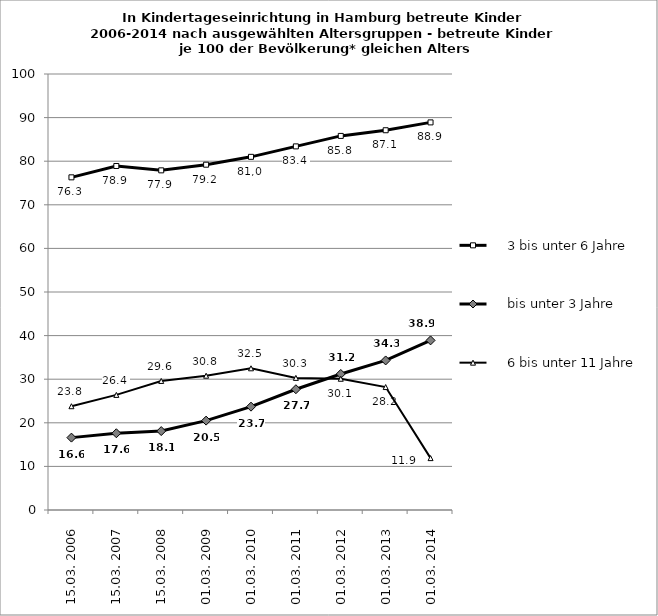
| Category |     3 bis unter 6 Jahre |     bis unter 3 Jahre |     6 bis unter 11 Jahre |
|---|---|---|---|
| 15.03. 2006 | 76.3 | 16.6 | 23.8 |
| 15.03. 2007 | 78.9 | 17.6 | 26.4 |
| 15.03. 2008 | 77.9 | 18.1 | 29.6 |
| 01.03. 2009 | 79.2 | 20.5 | 30.8 |
| 01.03. 2010 | 81 | 23.7 | 32.5 |
| 01.03. 2011 | 83.4 | 27.7 | 30.3 |
| 01.03. 2012 | 85.8 | 31.2 | 30.1 |
| 01.03. 2013 | 87.1 | 34.3 | 28.2 |
| 01.03. 2014 | 88.9 | 38.9 | 11.9 |